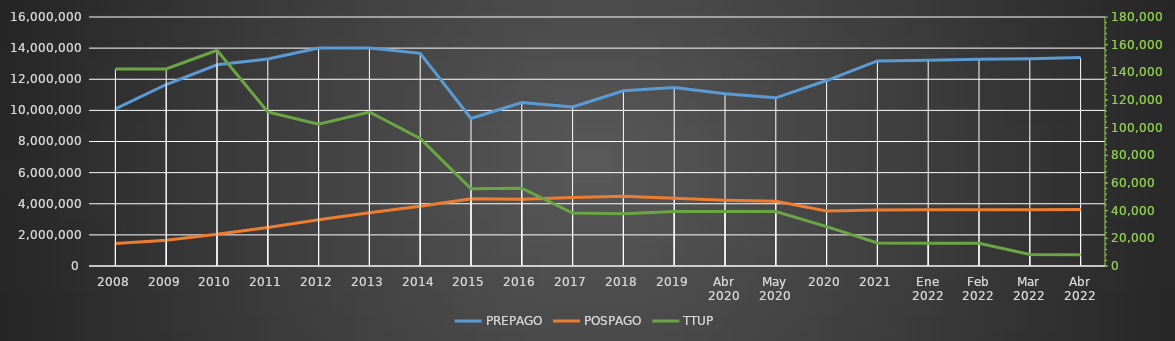
| Category | PREPAGO | POSPAGO |
|---|---|---|
| 2008 | 10097768 | 1452088 |
| 2009 | 11662294 | 1649838 |
| 2010 | 12929040 | 2033814 |
| 2011 | 13295834 | 2467378 |
| 2012 | 14008104 | 2976194 |
| 2013 | 14005126 | 3425277 |
| 2014 | 13666071 | 3846271 |
| 2015 | 9476240 | 4326937 |
| 2016 | 10498467 | 4293426 |
| 2017 | 10219457 | 4393703 |
| 2018 | 11254168 | 4480975 |
| 2019 | 11462048 | 4351686 |
| Abr 2020 | 11073657 | 4217911 |
| May 2020 | 10806656 | 4155948 |
| 2020 | 11917697 | 3539192 |
| 2021 | 13174530 | 3598383 |
| Ene 2022 | 13220510 | 3611202 |
| Feb 2022 | 13277237 | 3612124 |
| Mar 2022 | 13319621 | 3621700 |
| Abr 2022 | 13391496 | 3628201 |